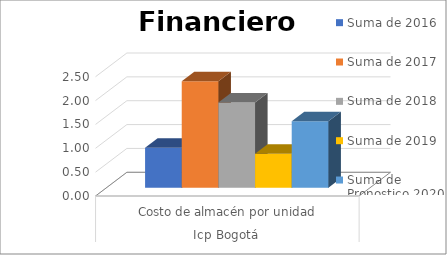
| Category | Suma de 2016 | Suma de 2017 | Suma de 2018 | Suma de 2019 | Suma de Pronostico 2020 suavización |
|---|---|---|---|---|---|
| 0 | 0.837 | 2.232 | 1.785 | 0.714 | 1.395 |